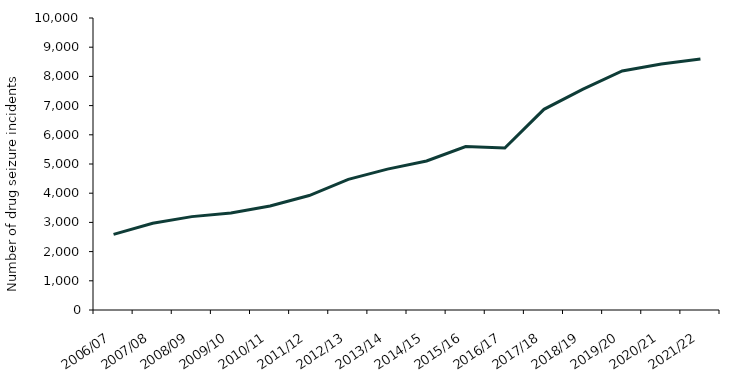
| Category | Drug seizure incidents |
|---|---|
| 2006/07 | 2590 |
| 2007/08 | 2968 |
| 2008/09 | 3198 |
| 2009/10 | 3319 |
| 2010/11 | 3564 |
| 2011/12 | 3920 |
| 2012/13 | 4474 |
| 2013/14 | 4825 |
| 2014/15 | 5103 |
| 2015/16 | 5597 |
| 2016/17 | 5546 |
| 2017/18 | 6872 |
| 2018/19 | 7561 |
| 2019/20 | 8186 |
| 2020/21 | 8428 |
| 2021/22 | 8594 |